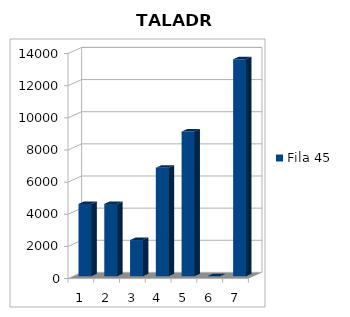
| Category | Fila 45 |
|---|---|
| 1 | 4500 |
| 2 | 4500 |
| 3 | 2250 |
| 4 | 6750 |
| 5 | 9000 |
| 6 | 0 |
| 7 | 13500 |